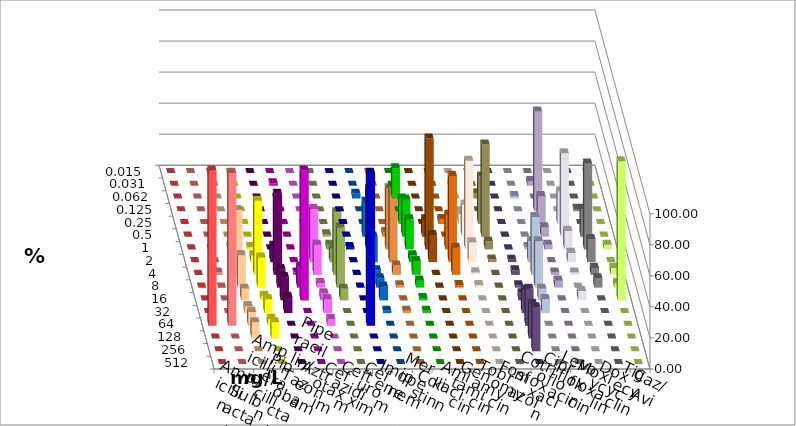
| Category | Ampicillin | Ampicillin/ Sulbactam | Piperacillin | Piperacillin/ Tazobactam | Aztreonam | Cefotaxim | Ceftazidim | Cefuroxim | Imipenem | Meropenem | Colistin | Amikacin | Gentamicin | Tobramycin | Fosfomycin | Cotrimoxazol | Ciprofloxacin | Levofloxacin | Moxifloxacin | Doxycyclin | Tigecyclin | Caz/Avi |
|---|---|---|---|---|---|---|---|---|---|---|---|---|---|---|---|---|---|---|---|---|---|---|
| 0.015 | 0 | 0 | 0 | 0 | 0 | 0 | 0 | 0 | 0 | 0 | 0 | 0 | 0 | 0 | 0 | 0 | 0 | 0 | 0 | 0 | 0 | 0 |
| 0.031 | 0 | 0 | 0 | 0 | 0 | 1.493 | 0 | 0 | 0 | 0 | 0 | 0 | 0 | 0 | 0 | 0 | 2.985 | 0 | 0 | 0 | 0 | 0 |
| 0.062 | 0 | 0 | 0 | 0 | 0 | 0 | 0 | 0 | 2.985 | 19.403 | 0 | 0 | 0 | 3.39 | 0 | 1.493 | 0 | 0 | 0 | 0 | 0 | 0 |
| 0.125 | 0 | 0 | 0 | 0 | 0 | 0 | 0 | 0 | 0 | 0 | 0 | 0 | 0 | 0 | 0 | 0 | 64.179 | 0 | 1.493 | 0 | 0 | 0 |
| 0.25 | 0 | 0 | 0 | 0 | 0 | 0 | 0 | 0 | 0 | 16.418 | 0 | 3.175 | 6.349 | 30.508 | 0 | 0 | 17.91 | 20.896 | 0 | 0 | 0 | 0 |
| 0.5 | 0 | 0 | 0 | 0 | 0 | 0 | 1.493 | 0 | 22.388 | 23.881 | 11.111 | 0 | 20.635 | 59.322 | 0 | 0 | 5.97 | 53.731 | 17.91 | 0 | 1.493 | 3.03 |
| 1.0 | 0 | 0 | 1.493 | 1.493 | 0 | 0 | 23.881 | 1.493 | 38.806 | 19.403 | 71.429 | 22.222 | 57.143 | 5.085 | 0 | 1.493 | 2.985 | 11.94 | 55.224 | 2.985 | 2.985 | 39.394 |
| 2.0 | 0 | 0 | 4.478 | 4.478 | 10.448 | 0 | 34.328 | 0 | 16.418 | 4.478 | 17.46 | 55.556 | 12.698 | 1.695 | 1.493 | 13.433 | 0 | 5.97 | 14.925 | 0 | 8.955 | 48.485 |
| 4.0 | 0 | 1.493 | 41.791 | 47.761 | 52.239 | 1.493 | 19.403 | 0 | 2.985 | 8.955 | 0 | 17.46 | 1.587 | 0 | 2.985 | 37.313 | 1.493 | 1.493 | 4.478 | 4.478 | 40.299 | 6.061 |
| 8.0 | 0 | 0 | 20.896 | 19.403 | 11.94 | 13.433 | 2.985 | 0 | 5.97 | 4.478 | 0 | 1.587 | 1.587 | 0 | 1.493 | 29.851 | 4.478 | 0 | 5.97 | 2.985 | 38.806 | 1.515 |
| 16.0 | 0 | 0 | 7.463 | 2.985 | 14.925 | 83.582 | 4.478 | 0 | 8.955 | 1.493 | 0 | 0 | 0 | 0 | 4.478 | 7.463 | 0 | 5.97 | 0 | 89.552 | 7.463 | 0 |
| 32.0 | 0 | 0 | 4.478 | 8.955 | 10.448 | 0 | 8.955 | 0 | 1.493 | 1.493 | 0 | 0 | 0 | 0 | 14.925 | 8.955 | 0 | 0 | 0 | 0 | 0 | 1.515 |
| 64.0 | 100 | 98.507 | 8.955 | 4.478 | 0 | 0 | 4.478 | 98.507 | 0 | 0 | 0 | 0 | 0 | 0 | 23.881 | 0 | 0 | 0 | 0 | 0 | 0 | 0 |
| 128.0 | 0 | 0 | 10.448 | 10.448 | 0 | 0 | 0 | 0 | 0 | 0 | 0 | 0 | 0 | 0 | 22.388 | 0 | 0 | 0 | 0 | 0 | 0 | 0 |
| 256.0 | 0 | 0 | 0 | 0 | 0 | 0 | 0 | 0 | 0 | 0 | 0 | 0 | 0 | 0 | 28.358 | 0 | 0 | 0 | 0 | 0 | 0 | 0 |
| 512.0 | 0 | 0 | 0 | 0 | 0 | 0 | 0 | 0 | 0 | 0 | 0 | 0 | 0 | 0 | 0 | 0 | 0 | 0 | 0 | 0 | 0 | 0 |